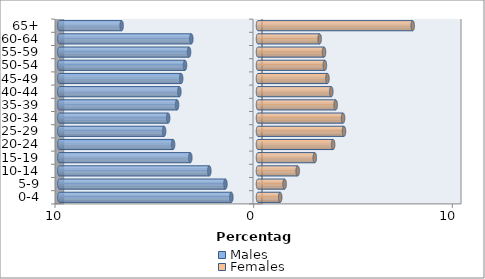
| Category | Males | Females |
|---|---|---|
| 0-4 | -1.342 | 1.117 |
| 5-9 | -1.64 | 1.338 |
| 10-14 | -2.45 | 1.998 |
| 15-19 | -3.407 | 2.859 |
| 20-24 | -4.274 | 3.781 |
| 25-29 | -4.725 | 4.328 |
| 30-34 | -4.522 | 4.281 |
| 35-39 | -4.074 | 3.909 |
| 40-44 | -3.958 | 3.689 |
| 45-49 | -3.867 | 3.495 |
| 50-54 | -3.675 | 3.367 |
| 55-59 | -3.47 | 3.323 |
| 60-64 | -3.357 | 3.102 |
| 65+ | -6.865 | 7.786 |